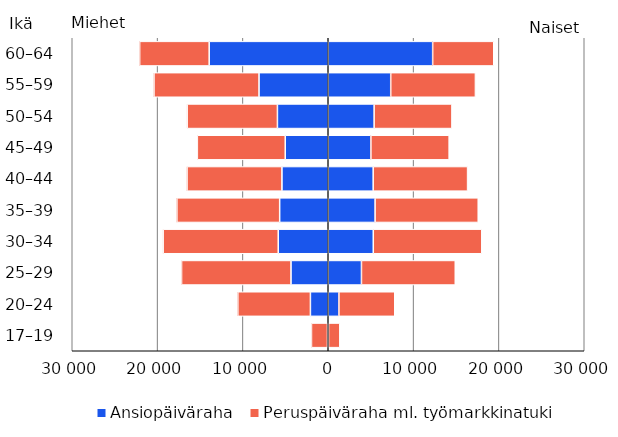
| Category | Ansiopäiväraha | Peruspäiväraha ml. työmarkkinatuki | Series 2 | Series 3 |
|---|---|---|---|---|
| 17–19 | -90 | -1875 | 32 | 1323 |
| 20–24 | -2091 | -8506 | 1249 | 6545 |
| 25–29 | -4364 | -12827 | 3892 | 10991 |
| 30–34 | -5861 | -13483 | 5277 | 12715 |
| 35–39 | -5691 | -12048 | 5491 | 12084 |
| 40–44 | -5426 | -11122 | 5267 | 11061 |
| 45–49 | -5040 | -10301 | 4997 | 9171 |
| 50–54 | -5956 | -10576 | 5377 | 9117 |
| 55–59 | -8112 | -12311 | 7322 | 9924 |
| 60–64 | -13952 | -8147 | 12236 | 7160 |